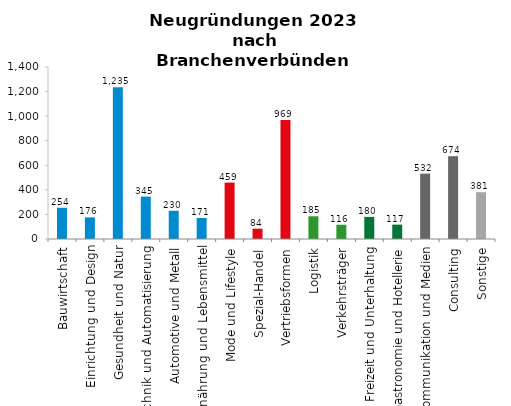
| Category | Series 1 |
|---|---|
| Bauwirtschaft | 254 |
| Einrichtung und Design | 176 |
| Gesundheit und Natur | 1235 |
| Technik und Automatisierung | 345 |
| Automotive und Metall | 230 |
| Ernährung und Lebensmittel | 171 |
| Mode und Lifestyle | 459 |
| Spezial-Handel | 84 |
| Vertriebsformen | 969 |
| Logistik | 185 |
| Verkehrsträger | 116 |
| Freizeit und Unterhaltung | 180 |
| Gastronomie und Hotellerie | 117 |
| Kommunikation und Medien | 532 |
| Consulting | 674 |
| Sonstige | 381 |